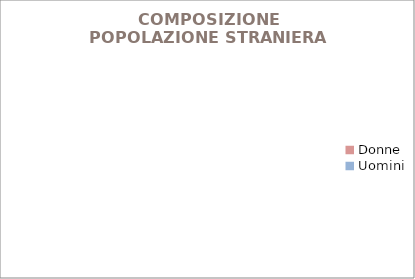
| Category | COMPOSIZIONE POPOLAZIONE STRANIERA PER GENERE -  |
|---|---|
| Donne | 0 |
| Uomini | 0 |